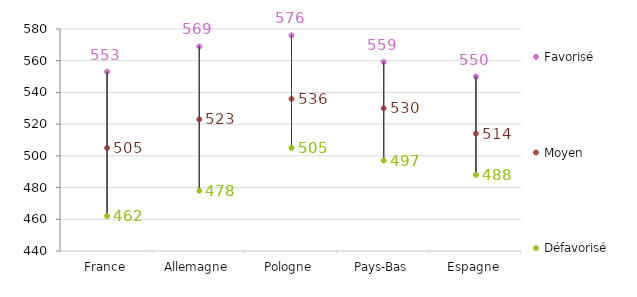
| Category | Favorisé | Moyen | Défavorisé |
|---|---|---|---|
| France | 553 | 505 | 462 |
| Allemagne | 568.969 | 523 | 478 |
| Pologne | 576 | 536 | 505 |
| Pays-Bas | 559.235 | 530 | 497 |
| Espagne | 550 | 514 | 488 |